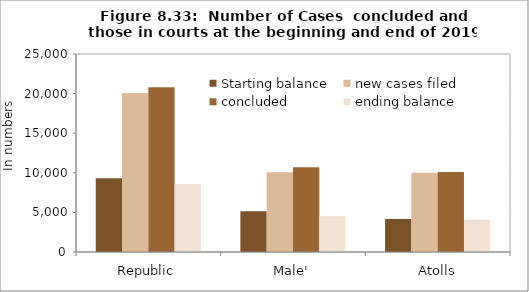
| Category | Starting balance | new cases filed | concluded | ending balance |
|---|---|---|---|---|
| Republic | 9313 | 20076 | 20788 | 8601 |
| Male' | 5143 | 10069 | 10686 | 4526 |
| Atolls | 4170 | 10007 | 10102 | 4075 |